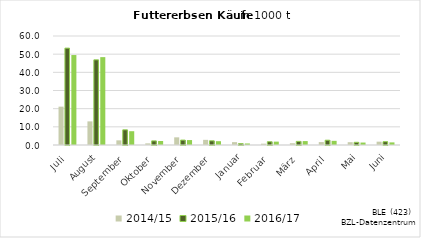
| Category | 2014/15 | 2015/16 | 2016/17 |
|---|---|---|---|
| Juli | 21.112 | 53.328 | 49.523 |
| August | 13.004 | 46.879 | 48.366 |
| September | 2.568 | 8.351 | 7.591 |
| Oktober | 0.907 | 2.265 | 2.187 |
| November | 4.215 | 2.709 | 2.719 |
| Dezember | 2.835 | 2.308 | 2.101 |
| Januar | 1.585 | 0.771 | 0.844 |
| Februar | 0.728 | 1.806 | 1.856 |
| März | 0.975 | 1.991 | 2.156 |
| April | 1.614 | 2.644 | 2.295 |
| Mai | 1.548 | 1.491 | 1.352 |
| Juni | 1.834 | 1.828 | 1.434 |